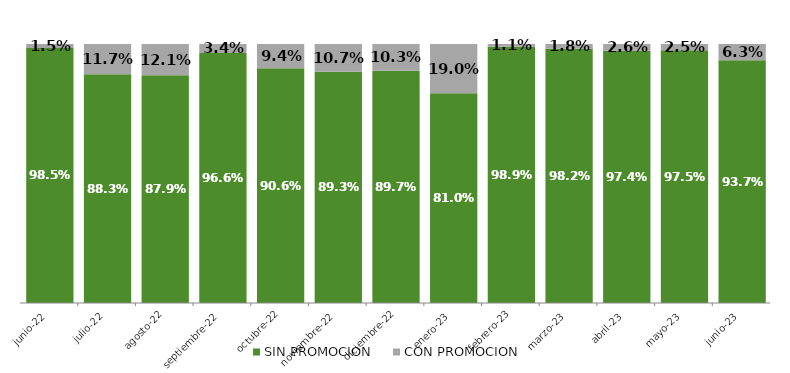
| Category | SIN PROMOCION   | CON PROMOCION   |
|---|---|---|
| 2022-06-01 | 0.985 | 0.015 |
| 2022-07-01 | 0.883 | 0.117 |
| 2022-08-01 | 0.879 | 0.121 |
| 2022-09-01 | 0.966 | 0.034 |
| 2022-10-01 | 0.906 | 0.094 |
| 2022-11-01 | 0.893 | 0.107 |
| 2022-12-01 | 0.897 | 0.103 |
| 2023-01-01 | 0.81 | 0.19 |
| 2023-02-01 | 0.989 | 0.011 |
| 2023-03-01 | 0.982 | 0.018 |
| 2023-04-01 | 0.974 | 0.026 |
| 2023-05-01 | 0.975 | 0.025 |
| 2023-06-01 | 0.937 | 0.063 |